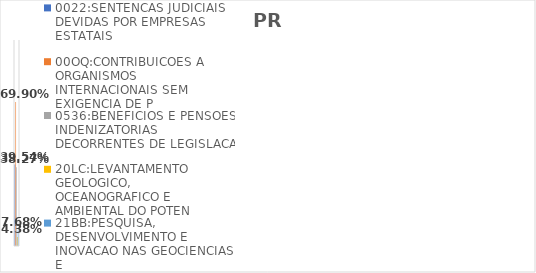
| Category | 0022:SENTENCAS JUDICIAIS DEVIDAS POR EMPRESAS ESTATAIS | 00OQ:CONTRIBUICOES A ORGANISMOS INTERNACIONAIS SEM EXIGENCIA DE P | 0536:BENEFICIOS E PENSOES INDENIZATORIAS DECORRENTES DE LEGISLACA | 20LC:LEVANTAMENTO GEOLOGICO, OCEANOGRAFICO E AMBIENTAL DO POTEN | 21BB:PESQUISA, DESENVOLVIMENTO E INOVACAO NAS GEOCIENCIAS E |
|---|---|---|---|---|---|
| EXECUTADO | 0.395 | 0.699 | 0.383 | 0.044 | 0.077 |